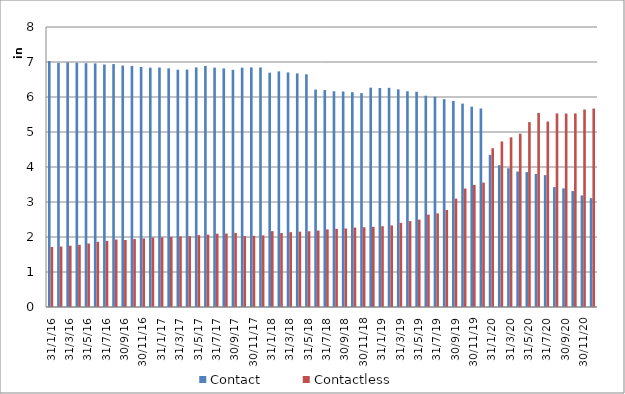
| Category | Contact | Contactless |
|---|---|---|
| 31/1/16 | 7027213 | 1714950 |
| 29/2/16 | 6975506 | 1727887 |
| 31/3/16 | 6989930 | 1751512 |
| 30/4/16 | 6979564 | 1776886 |
| 31/5/16 | 6966648 | 1814233 |
| 30/6/16 | 6959395 | 1862700 |
| 31/7/16 | 6927310 | 1889925 |
| 31/8/16 | 6941145 | 1926289 |
| 30/9/16 | 6897213 | 1914070 |
| 31/10/16 | 6887436 | 1941595 |
| 30/11/16 | 6859426 | 1959545 |
| 31/12/16 | 6837748 | 1985072 |
| 31/1/17 | 6842786 | 1990487 |
| 28/2/17 | 6817679 | 2002822 |
| 31/3/17 | 6780498 | 2014680 |
| 30/4/17 | 6783872 | 2020822 |
| 31/5/17 | 6845404 | 2053495 |
| 30/6/17 | 6889221 | 2067311 |
| 31/7/17 | 6838214 | 2093973 |
| 31/8/17 | 6815969 | 2098074 |
| 30/9/17 | 6776918 | 2117254 |
| 31/10/17 | 6838182 | 2025505 |
| 30/11/17 | 6845606 | 2035069 |
| 31/12/17 | 6844238 | 2046570 |
| 31/1/18 | 6695011 | 2167243 |
| 28/2/18 | 6732191 | 2115009 |
| 31/3/18 | 6702220 | 2137473 |
| 30/4/18 | 6673960 | 2151788 |
| 31/5/18 | 6646978 | 2164164 |
| 30/6/18 | 6211852 | 2184523 |
| 31/7/18 | 6198227 | 2216763 |
| 31/8/18 | 6163335 | 2233398 |
| 30/9/18 | 6156227 | 2242857 |
| 31/10/18 | 6138561 | 2269603 |
| 30/11/18 | 6111801 | 2280333 |
| 31/12/18 | 6267590 | 2290475 |
| 31/1/19 | 6258361 | 2307838 |
| 28/2/19 | 6262083 | 2331039 |
| 31/3/19 | 6218082 | 2403112 |
| 30/4/19 | 6164493 | 2454122 |
| 31/5/19 | 6149460 | 2496287 |
| 30/6/19 | 6037684 | 2639589 |
| 31/7/19 | 6006840 | 2674818 |
| 31/8/19 | 5937719 | 2773117 |
| 30/9/19 | 5887780 | 3095912 |
| 31/10/19 | 5811685 | 3384890 |
| 30/11/19 | 5723018 | 3489993 |
| 31/12/19 | 5670701 | 3554151 |
| 31/1/20 | 4346407 | 4535875 |
| 29/2/20 | 4052838 | 4730560 |
| 31/3/20 | 3963662 | 4847816 |
| 30/4/20 | 3871261 | 4951259 |
| 31/5/20 | 3854633 | 5281387 |
| 30/6/20 | 3802061 | 5542911 |
| 31/7/20 | 3767638 | 5299995 |
| 31/8/20 | 3424948 | 5532239 |
| 30/9/20 | 3389747 | 5528024 |
| 31/10/20 | 3312651 | 5532192 |
| 30/11/20 | 3187440 | 5642453 |
| 31/12/20 | 3109660 | 5670596 |